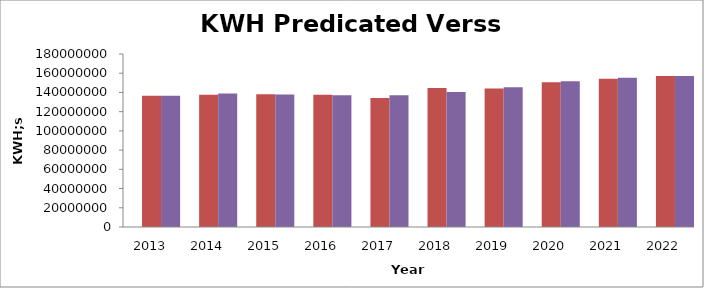
| Category | Year | kWh Purchased | Weather Normalized kWh |
|---|---|---|---|
| 2013.0 | 2013 | 136652392.51 | 136638837.101 |
| 2014.0 | 2014 | 137567233.45 | 138847385.75 |
| 2015.0 | 2015 | 137993374.6 | 137759492.497 |
| 2016.0 | 2016 | 137727428.07 | 137131414.941 |
| 2017.0 | 2017 | 134234594 | 136986366.914 |
| 2018.0 | 2018 | 144593587.54 | 140544492.409 |
| 2019.0 | 2019 | 144125560.61 | 145329634.882 |
| 2020.0 | 2020 | 150603831.59 | 151709224.206 |
| 2021.0 | 2021 | 154199190.51 | 155206961.496 |
| 2022.0 | 2022 | 157082097.17 | 157201772.51 |